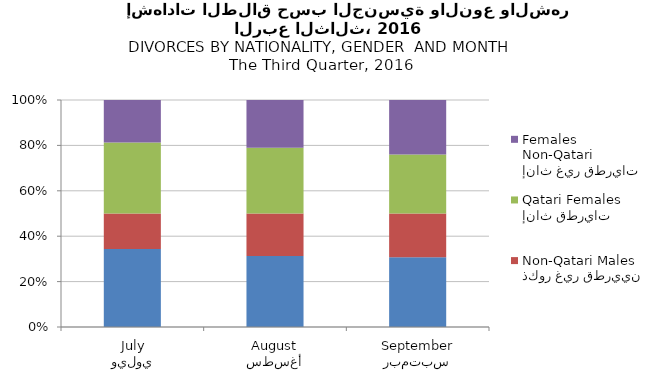
| Category | ذكور قطريون
Qatari Males | ذكور غير قطريين
Non-Qatari Males | إناث قطريات
Qatari Females | إناث غير قطريات
Non-Qatari Females |
|---|---|---|---|---|
| يوليو
July | 33 | 15 | 30 | 18 |
| أغسطس
August | 55 | 33 | 51 | 37 |
| سبتمبر
September | 59 | 37 | 50 | 46 |